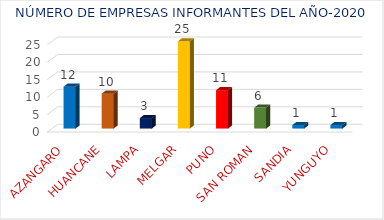
| Category | Series 0 |
|---|---|
| AZANGARO | 12 |
| HUANCANE | 10 |
| LAMPA | 3 |
| MELGAR | 25 |
| PUNO | 11 |
| SAN ROMAN | 6 |
| SANDIA | 1 |
| YUNGUYO | 1 |